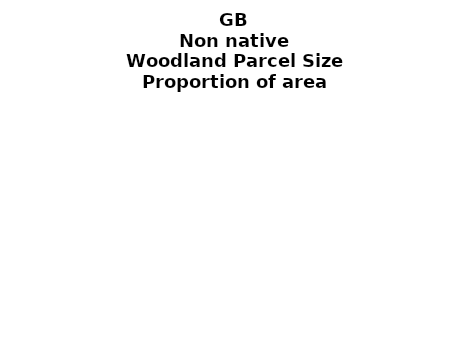
| Category | Non native |
|---|---|
| <5 ha | 0.029 |
| ≥5 and <10 ha | 0.013 |
| ≥10 and <15 ha | 0.011 |
| ≥15 and <20 ha | 0.009 |
| ≥20 and <25 ha | 0.007 |
| ≥25 and <30 ha | 0.007 |
| ≥30 and <35 ha | 0.005 |
| ≥35 and <40 ha | 0.005 |
| ≥40 and <45 ha | 0.004 |
| ≥45 and <50 ha | 0.004 |
| ≥50 and <60 ha | 0.01 |
| ≥60 and <70 ha | 0.008 |
| ≥70 and <80 ha | 0.007 |
| ≥80 and <90 ha | 0.006 |
| ≥90 and <100 ha | 0.006 |
| ≥100 and <150 ha | 0.023 |
| ≥150 and <200 ha | 0.018 |
| ≥200 ha | 0.307 |